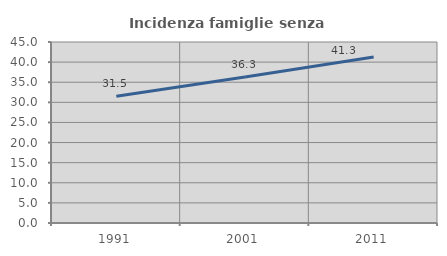
| Category | Incidenza famiglie senza nuclei |
|---|---|
| 1991.0 | 31.522 |
| 2001.0 | 36.285 |
| 2011.0 | 41.263 |